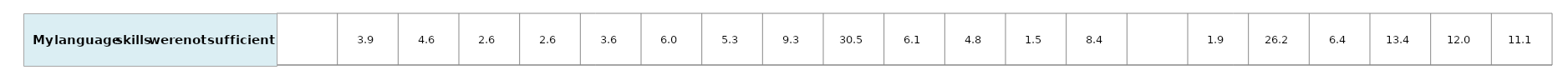
| Category | #REF! |
|---|---|
| nan | 1 |
| 3.92495484132901 | 1 |
| 4.59810162009601 | 1 |
| 2.55458706921869 | 1 |
| 2.64667695086627 | 1 |
| 3.60685172153147 | 1 |
| 5.95359210660956 | 1 |
| 5.289780164269111 | 1 |
| 9.348398851917 | 1 |
| 30.532735679587432 | 1 |
| 6.06335623964271 | 1 |
| 4.79285214682761 | 1 |
| 1.4682483739994199 | 1 |
| 8.433771556132378 | 1 |
| nan | 1 |
| 1.9450402622889302 | 1 |
| 26.24334135285939 | 1 |
| 6.3768045424709 | 1 |
| 13.39425396595278 | 1 |
| 12.01187653122294 | 1 |
| 11.05643558969355 | 1 |